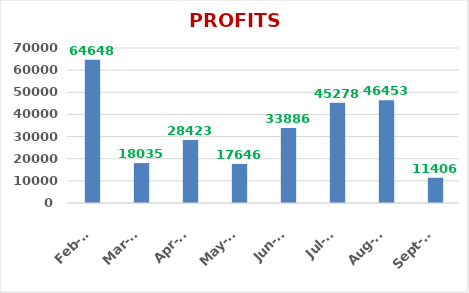
| Category | PROFITS (Rs.) |
|---|---|
| 2019-09-01 | 11406 |
| 2019-08-01 | 46453 |
| 2019-07-01 | 45278 |
| 2019-06-01 | 33886 |
| 2019-05-01 | 17646 |
| 2019-04-01 | 28423 |
| 2019-03-01 | 18035 |
| 2019-02-01 | 64648 |